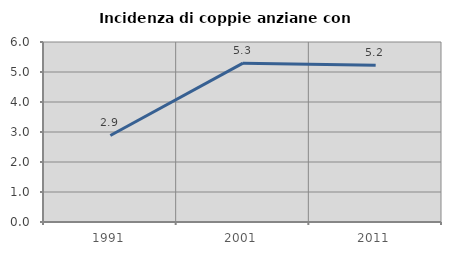
| Category | Incidenza di coppie anziane con figli |
|---|---|
| 1991.0 | 2.885 |
| 2001.0 | 5.294 |
| 2011.0 | 5.229 |